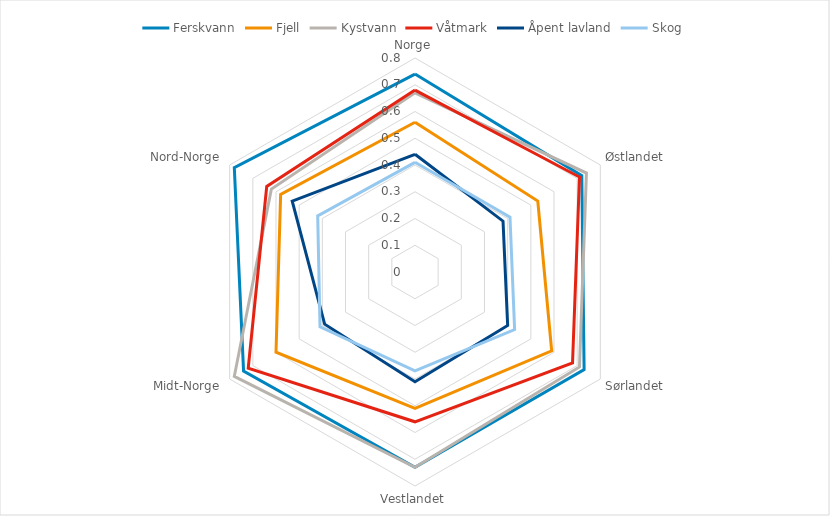
| Category | Ferskvann | Fjell | Kystvann | Våtmark | Åpent lavland | Skog |
|---|---|---|---|---|---|---|
| Norge | 0.74 | 0.56 | 0.67 | 0.68 | 0.44 | 0.41 |
| Østlandet | 0.72 | 0.53 | 0.74 | 0.71 | 0.38 | 0.41 |
| Sørlandet | 0.73 | 0.59 | 0.71 | 0.68 | 0.4 | 0.43 |
| Vestlandet | 0.73 | 0.51 | 0.73 | 0.56 | 0.41 | 0.37 |
| Midt-Norge | 0.74 | 0.6 | 0.78 | 0.72 | 0.39 | 0.41 |
| Nord-Norge | 0.78 | 0.58 | 0.62 | 0.64 | 0.53 | 0.42 |